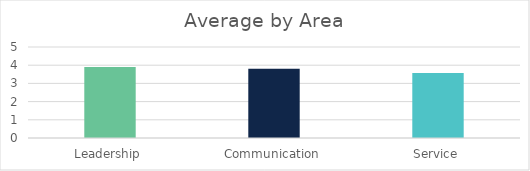
| Category | Series 0 |
|---|---|
| Leadership | 3.9 |
| Communication | 3.8 |
| Service | 3.57 |